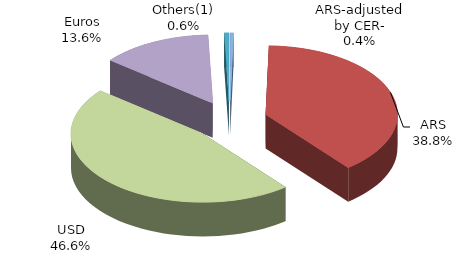
| Category | Series 0 |
|---|---|
| ARS-adjusted by CER- | 381735.785 |
| ARS | 37388249.056 |
| USD | 44869048.124 |
| Euros | 13113354.188 |
| Others(1) | 561425.749 |